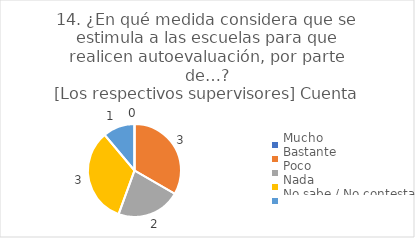
| Category | 14. ¿En qué medida considera que se estimula a las escuelas para que realicen autoevaluación, por parte de…?
[Los respectivos supervisores] |
|---|---|
| Mucho  | 0 |
| Bastante  | 0.333 |
| Poco  | 0.222 |
| Nada  | 0.333 |
| No sabe / No contesta | 0.111 |